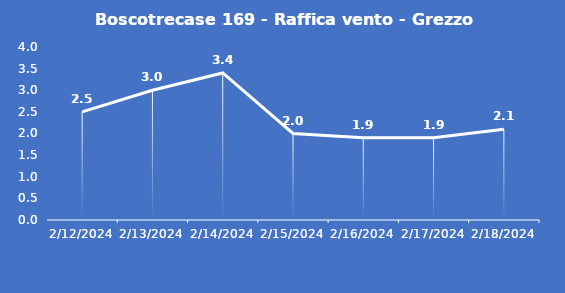
| Category | Boscotrecase 169 - Raffica vento - Grezzo (m/s) |
|---|---|
| 2/12/24 | 2.5 |
| 2/13/24 | 3 |
| 2/14/24 | 3.4 |
| 2/15/24 | 2 |
| 2/16/24 | 1.9 |
| 2/17/24 | 1.9 |
| 2/18/24 | 2.1 |